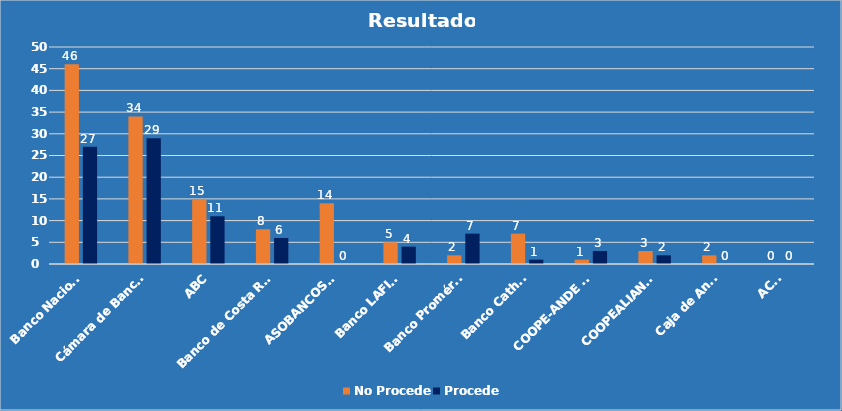
| Category | No Procede | Procede |
|---|---|---|
| Banco Nacional | 46 | 27 |
| Cámara de Bancos  | 34 | 29 |
| ABC | 15 | 11 |
| Banco de Costa Rica | 8 | 6 |
| ASOBANCOSTA | 14 | 0 |
| Banco LAFISE  | 5 | 4 |
| Banco Promérica | 2 | 7 |
| Banco Cathay | 7 | 1 |
| COOPE-ANDE N°1 | 1 | 3 |
| COOPEALIANZA  | 3 | 2 |
| Caja de Ande | 2 | 0 |
| ACOP | 0 | 0 |